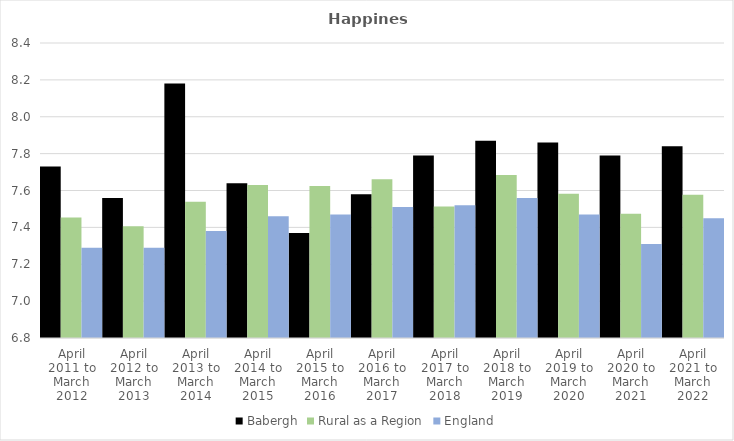
| Category | Babergh | Rural as a Region | England |
|---|---|---|---|
| April 2011 to March 2012 | 7.73 | 7.454 | 7.29 |
| April 2012 to March 2013 | 7.56 | 7.406 | 7.29 |
| April 2013 to March 2014 | 8.18 | 7.539 | 7.38 |
| April 2014 to March 2015 | 7.64 | 7.63 | 7.46 |
| April 2015 to March 2016 | 7.37 | 7.625 | 7.47 |
| April 2016 to March 2017 | 7.58 | 7.661 | 7.51 |
| April 2017 to March 2018 | 7.79 | 7.513 | 7.52 |
| April 2018 to March 2019 | 7.87 | 7.684 | 7.56 |
| April 2019 to March 2020 | 7.86 | 7.582 | 7.47 |
| April 2020 to March 2021 | 7.79 | 7.474 | 7.31 |
| April 2021 to March 2022 | 7.84 | 7.577 | 7.45 |